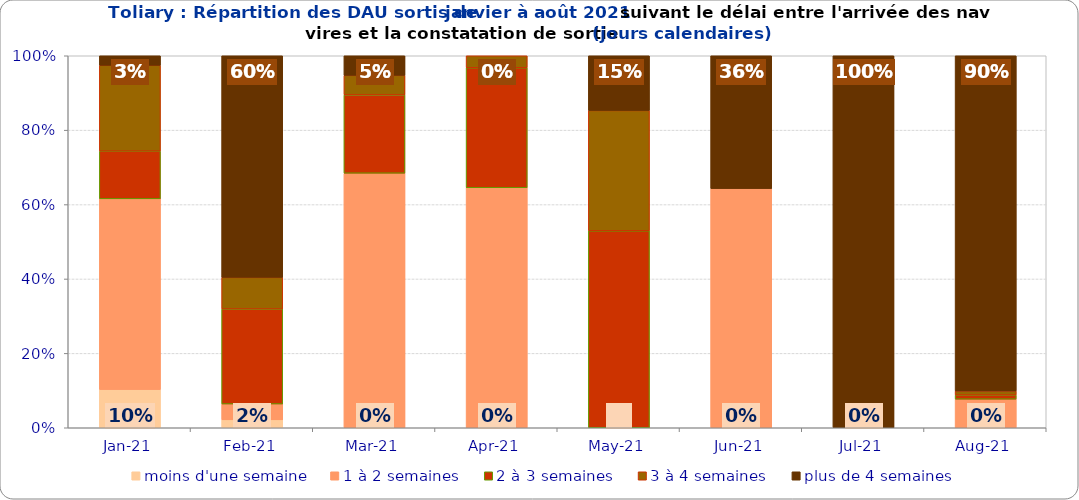
| Category | moins d'une semaine | 1 à 2 semaines | 2 à 3 semaines | 3 à 4 semaines | plus de 4 semaines |
|---|---|---|---|---|---|
| 2021-01-01 | 0.103 | 0.513 | 0.128 | 0.231 | 0.026 |
| 2021-02-01 | 0.021 | 0.043 | 0.255 | 0.085 | 0.596 |
| 2021-03-01 | 0 | 0.684 | 0.211 | 0.053 | 0.053 |
| 2021-04-01 | 0 | 0.645 | 0.323 | 0.032 | 0 |
| 2021-05-01 | 0 | 0 | 0.529 | 0.324 | 0.147 |
| 2021-06-01 | 0 | 0.643 | 0 | 0 | 0.357 |
| 2021-07-01 | 0 | 0 | 0 | 0 | 1 |
| 2021-08-01 | 0 | 0.077 | 0.011 | 0.011 | 0.901 |